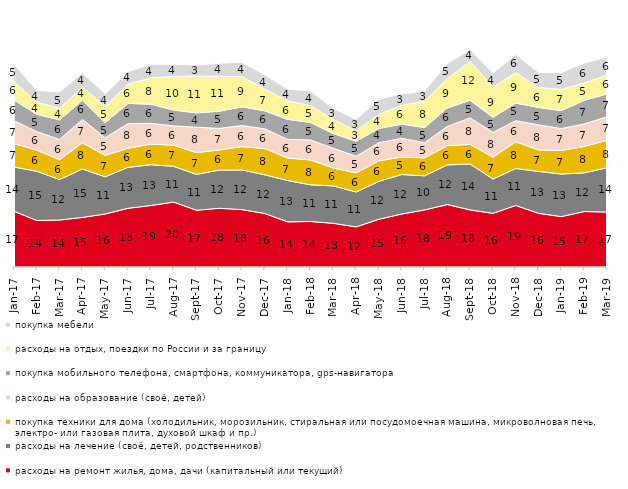
| Category | расходы на ремонт жилья, дома, дачи (капитальный или текущий) | расходы на лечение (своё, детей, родственников) | покупка техники для дома (холодильник, морозильник, стиральная или посудомоечная машина, микроволновая печь, электро- или газовая плита, духовой шкаф и пр.) | расходы на образование (своё, детей) | покупка мобильного телефона, смартфона, коммуникатора, gps-навигатора | расходы на отдых, поездки по России и за границу | покупка мебели |
|---|---|---|---|---|---|---|---|
| 2017-01-01 | 17.1 | 13.55 | 7.2 | 7 | 6.35 | 5.65 | 5.3 |
| 2017-02-01 | 14.25 | 15.1 | 6.45 | 5.7 | 5.3 | 3.7 | 3.6 |
| 2017-03-01 | 14.4 | 12.4 | 6.1 | 6.2 | 6 | 3.55 | 5.05 |
| 2017-04-01 | 15.2 | 14.85 | 8.05 | 7.1 | 5.95 | 3.95 | 4.35 |
| 2017-05-01 | 16.25 | 11.4 | 6.55 | 5.45 | 4.6 | 5 | 3.75 |
| 2017-06-01 | 18 | 12.55 | 5.85 | 7.55 | 6.2 | 5.9 | 3.85 |
| 2017-07-01 | 18.85 | 12.5 | 6.3 | 6.4 | 5.85 | 8.05 | 4.15 |
| 2017-08-01 | 19.9 | 10.95 | 6.5 | 5.9 | 4.85 | 10.3 | 3.7 |
| 2017-09-01 | 17.4 | 11 | 6.65 | 7.8 | 4.4 | 11.3 | 3.4 |
| 2017-10-01 | 18 | 11.7 | 6.2 | 6.6 | 5.25 | 10.7 | 4 |
| 2017-11-01 | 17.6 | 12.15 | 7.15 | 6.45 | 5.75 | 9.25 | 4.4 |
| 2017-12-01 | 16.4 | 11.85 | 8.05 | 6.05 | 5.5 | 6.65 | 4.35 |
| 2018-01-01 | 13.85 | 12.65 | 6.9 | 5.7 | 6.15 | 5.65 | 3.65 |
| 2018-02-01 | 13.95 | 11.25 | 7.6 | 6.15 | 5.35 | 5.2 | 4.4 |
| 2018-03-01 | 13.4 | 11.45 | 5.5 | 6.05 | 4.5 | 4.3 | 3.45 |
| 2018-04-01 | 12.3 | 10.7 | 5.85 | 5.1 | 4.6 | 3.25 | 3.45 |
| 2018-05-01 | 14.65 | 11.6 | 6.3 | 5.55 | 4.4 | 4.3 | 4.65 |
| 2018-06-01 | 16.25 | 12.1 | 5.35 | 5.75 | 4.35 | 5.8 | 3.45 |
| 2018-07-01 | 17.5 | 10.45 | 5.5 | 4.65 | 4.65 | 8.05 | 3.1 |
| 2018-08-01 | 19.15 | 12.15 | 5.9 | 5.9 | 5.65 | 9 | 4.6 |
| 2018-09-01 | 17.5 | 14.05 | 6.05 | 8.1 | 5.4 | 11.9 | 3.6 |
| 2018-10-01 | 16.45 | 10.5 | 6.7 | 7.6 | 4.65 | 9.25 | 4.3 |
| 2018-11-01 | 18.862 | 11.327 | 8.184 | 6.487 | 5.389 | 9.281 | 5.589 |
| 2018-12-01 | 16.45 | 12.85 | 6.6 | 7.65 | 5.35 | 6.1 | 4.65 |
| 2019-01-01 | 15.45 | 13.05 | 7.25 | 6.7 | 5.5 | 6.5 | 5.15 |
| 2019-02-01 | 17 | 11.85 | 8.1 | 6.9 | 7.2 | 5.35 | 6.1 |
| 2019-03-01 | 16.857 | 13.575 | 8.404 | 7.21 | 7.011 | 5.768 | 5.52 |